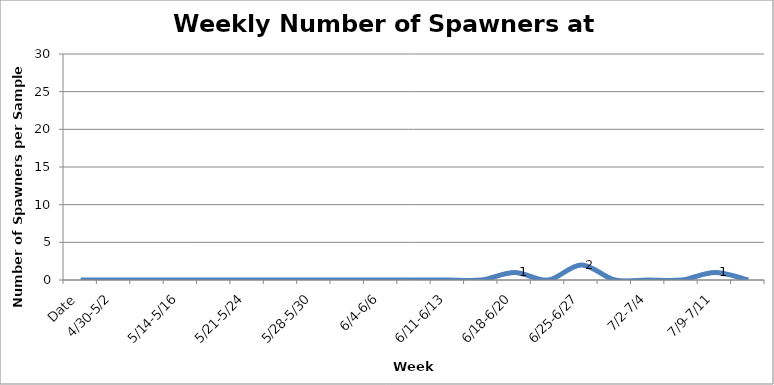
| Category | Series 0 |
|---|---|
| Date | 0 |
| 4/30-5/2 | 0 |
|  | 0 |
| 5/14-5/16 | 0 |
|  | 0 |
| 5/21-5/24 | 0 |
|  | 0 |
| 5/28-5/30 | 0 |
|  | 0 |
| 6/4-6/6 | 0 |
|  | 0 |
| 6/11-6/13 | 0 |
|  | 0 |
| 6/18-6/20 | 1 |
|  | 0 |
| 6/25-6/27 | 2 |
|  | 0 |
| 7/2-7/4 | 0 |
|  | 0 |
| 7/9-7/11 | 1 |